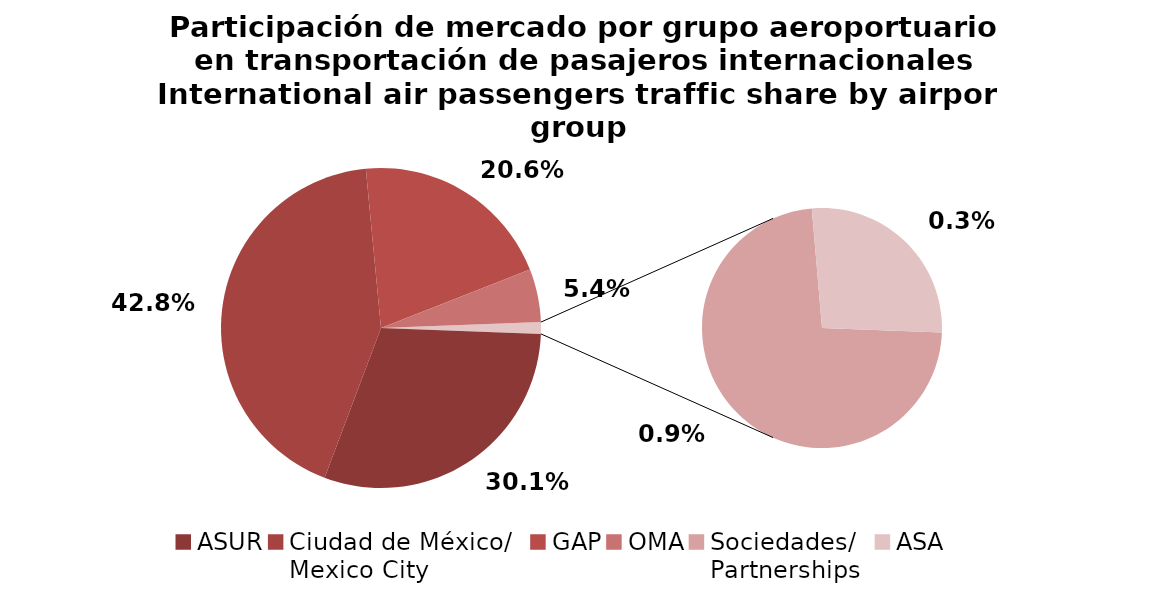
| Category | Series 0 |
|---|---|
| ASUR | 938.351 |
| Ciudad de México/
Mexico City | 1330.829 |
| GAP | 639.934 |
| OMA | 167.036 |
| Sociedades/
Partnerships | 26.705 |
| ASA | 9.849 |